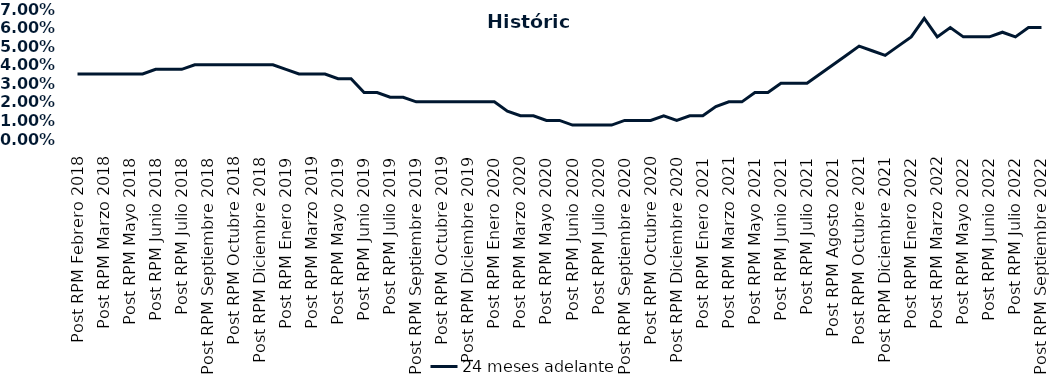
| Category | 24 meses adelante  |
|---|---|
| Post RPM Febrero 2018 | 0.035 |
| Pre RPM Marzo 2018 | 0.035 |
| Post RPM Marzo 2018 | 0.035 |
| Pre RPM Mayo 2018 | 0.035 |
| Post RPM Mayo 2018 | 0.035 |
| Pre RPM Junio 2018 | 0.035 |
| Post RPM Junio 2018 | 0.038 |
| Pre RPM Julio 2018 | 0.038 |
| Post RPM Julio 2018 | 0.038 |
| Pre RPM Septiembre 2018 | 0.04 |
| Post RPM Septiembre 2018 | 0.04 |
| Pre RPM Octubre 2018 | 0.04 |
| Post RPM Octubre 2018 | 0.04 |
| Pre RPM Diciembre 2018 | 0.04 |
| Post RPM Diciembre 2018 | 0.04 |
| Pre RPM Enero 2019 | 0.04 |
| Post RPM Enero 2019 | 0.038 |
| Pre RPM Marzo 2019 | 0.035 |
| Post RPM Marzo 2019 | 0.035 |
| Pre RPM Mayo 2019 | 0.035 |
| Post RPM Mayo 2019 | 0.032 |
| Pre RPM Junio 2019 | 0.032 |
| Post RPM Junio 2019 | 0.025 |
| Pre RPM Julio 2019 | 0.025 |
| Post RPM Julio 2019 | 0.022 |
| Pre RPM Septiembre 2019 | 0.022 |
| Post RPM Septiembre 2019 | 0.02 |
| Pre RPM Octubre 2019 | 0.02 |
| Post RPM Octubre 2019 | 0.02 |
| Pre RPM Diciembre 2019 | 0.02 |
| Post RPM Diciembre 2019 | 0.02 |
| Pre RPM Enero 2020 | 0.02 |
| Post RPM Enero 2020 | 0.02 |
| Pre RPM Marzo 2020 | 0.015 |
| Post RPM Marzo 2020 | 0.012 |
| Pre RPM Mayo 2020 | 0.012 |
| Post RPM Mayo 2020 | 0.01 |
| Pre RPM Junio 2020 | 0.01 |
| Post RPM Junio 2020 | 0.008 |
| Pre RPM Julio 2020 | 0.008 |
| Post RPM Julio 2020 | 0.008 |
| Pre RPM Septiembre 2020 | 0.008 |
| Post RPM Septiembre 2020 | 0.01 |
| Pre RPM Octubre 2020 | 0.01 |
| Post RPM Octubre 2020 | 0.01 |
| Pre RPM Diciembre 2020 | 0.012 |
| Post RPM Diciembre 2020 | 0.01 |
| Pre RPM Enero 2021 | 0.012 |
| Post RPM Enero 2021 | 0.012 |
| Pre RPM Marzo 2021 | 0.018 |
| Post RPM Marzo 2021 | 0.02 |
| Pre RPM Mayo 2021 | 0.02 |
| Post RPM Mayo 2021 | 0.025 |
| Pre RPM Junio 2021 | 0.025 |
| Post RPM Junio 2021 | 0.03 |
| Pre RPM Julio 2021 | 0.03 |
| Post RPM Julio 2021 | 0.03 |
| Pre RPM Agosto 2021 | 0.035 |
| Post RPM Agosto 2021 | 0.04 |
| Pre RPM Octubre 2021 | 0.045 |
| Post RPM Octubre 2021 | 0.05 |
| Pre RPM Diciembre 2021 | 0.048 |
| Post RPM Diciembre 2021 | 0.045 |
| Pre RPM Enero 2022 | 0.05 |
| Post RPM Enero 2022 | 0.055 |
| Pre RPM Marzo 2022 | 0.065 |
| Post RPM Marzo 2022 | 0.055 |
| Pre RPM Mayo 2022 | 0.06 |
| Post RPM Mayo 2022 | 0.055 |
| Pre RPM Junio 2022 | 0.055 |
| Post RPM Junio 2022 | 0.055 |
| Pre RPM Julio 2022 | 0.058 |
| Post RPM Julio 2022 | 0.055 |
| Pre RPM Septiembre 2022 | 0.06 |
| Post RPM Septiembre 2022 | 0.06 |